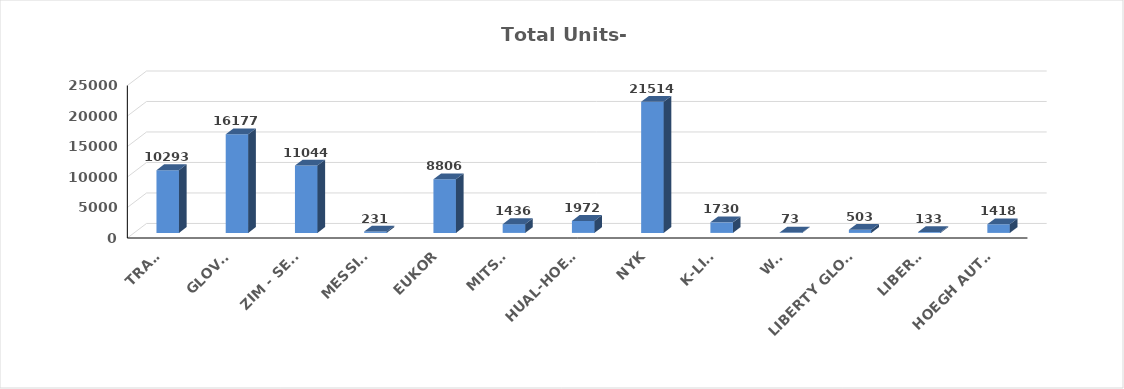
| Category | Series 0 |
|---|---|
| TRAMP | 10293 |
| GLOVIS | 16177 |
| ZIM - SETH | 11044 |
| MESSINA | 231 |
| EUKOR | 8806 |
| MITSUI | 1436 |
| HUAL-HOEGH | 1972 |
| NYK | 21514 |
| K-LINE | 1730 |
| WWL | 73 |
| LIBERTY GLOBA | 503 |
| LIBERTY | 133 |
| HOEGH AUTOLIN | 1418 |